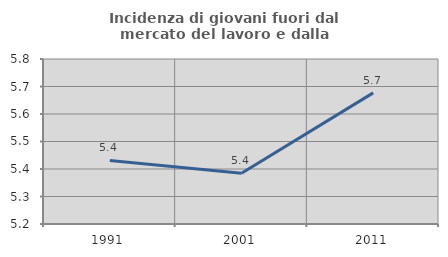
| Category | Incidenza di giovani fuori dal mercato del lavoro e dalla formazione  |
|---|---|
| 1991.0 | 5.431 |
| 2001.0 | 5.385 |
| 2011.0 | 5.677 |